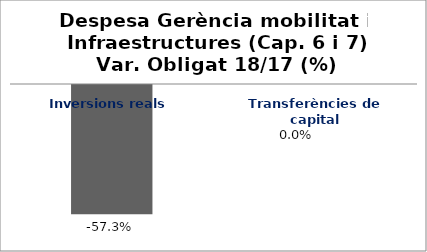
| Category | Series 0 |
|---|---|
| Inversions reals | -0.573 |
| Transferències de capital | 0 |